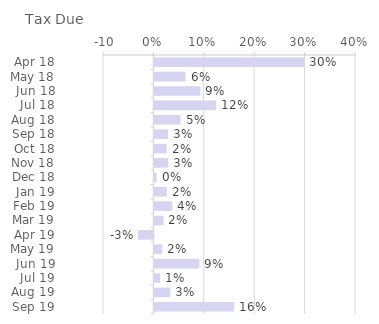
| Category | Tax Due |
|---|---|
| Apr 18 | 0.297 |
| May 18 | 0.062 |
| Jun 18 | 0.091 |
| Jul 18 | 0.122 |
| Aug 18 | 0.052 |
| Sep 18 | 0.027 |
| Oct 18 | 0.024 |
| Nov 18 | 0.027 |
| Dec 18 | 0.005 |
| Jan 19 | 0.025 |
| Feb 19 | 0.036 |
| Mar 19 | 0.018 |
| Apr 19 | -0.031 |
| May 19 | 0.015 |
| Jun 19 | 0.089 |
| Jul 19 | 0.011 |
| Aug 19 | 0.031 |
| Sep 19 | 0.158 |